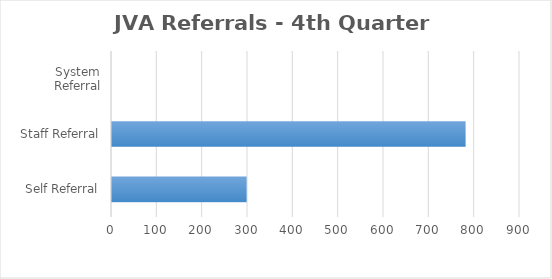
| Category | Series 0 |
|---|---|
| Self Referral | 297 |
| Staff Referral | 780 |
| System Referral | 0 |